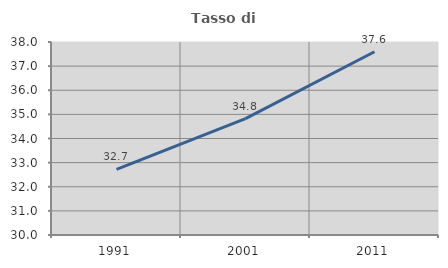
| Category | Tasso di occupazione   |
|---|---|
| 1991.0 | 32.724 |
| 2001.0 | 34.821 |
| 2011.0 | 37.595 |